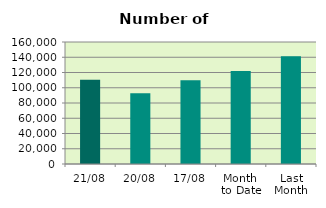
| Category | Series 0 |
|---|---|
| 21/08 | 110482 |
| 20/08 | 92712 |
| 17/08 | 109880 |
| Month 
to Date | 121840 |
| Last
Month | 141432.273 |